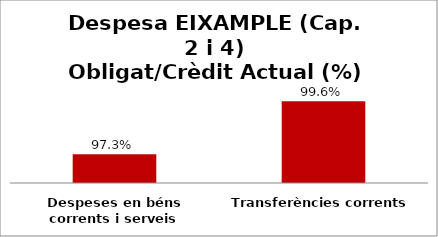
| Category | Series 0 |
|---|---|
| Despeses en béns corrents i serveis | 0.973 |
| Transferències corrents | 0.996 |